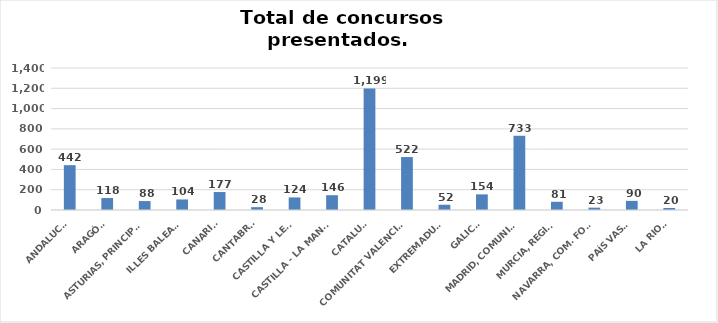
| Category | Series 0 |
|---|---|
| ANDALUCÍA | 442 |
| ARAGÓN | 118 |
| ASTURIAS, PRINCIPADO | 88 |
| ILLES BALEARS | 104 |
| CANARIAS | 177 |
| CANTABRIA | 28 |
| CASTILLA Y LEÓN | 124 |
| CASTILLA - LA MANCHA | 146 |
| CATALUÑA | 1199 |
| COMUNITAT VALENCIANA | 522 |
| EXTREMADURA | 52 |
| GALICIA | 154 |
| MADRID, COMUNIDAD | 733 |
| MURCIA, REGIÓN | 81 |
| NAVARRA, COM. FORAL | 23 |
| PAÍS VASCO | 90 |
| LA RIOJA | 20 |